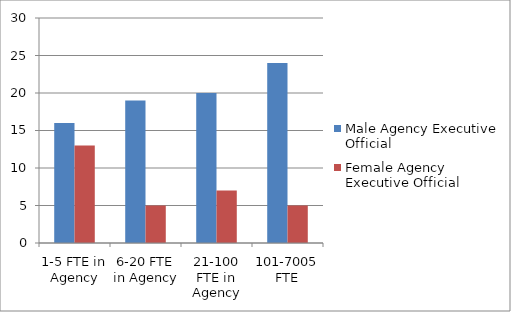
| Category | Male Agency Executive Official | Female Agency Executive Official |
|---|---|---|
| 1-5 FTE in Agency | 16 | 13 |
| 6-20 FTE in Agency | 19 | 5 |
| 21-100 FTE in Agency | 20 | 7 |
| 101-7005 FTE | 24 | 5 |